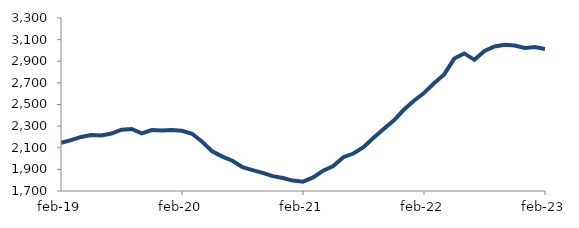
| Category | Series 0 |
|---|---|
| 2019-02-01 | 2144.876 |
| 2019-03-01 | 2171.077 |
| 2019-04-01 | 2199.941 |
| 2019-05-01 | 2218.125 |
| 2019-06-01 | 2213.708 |
| 2019-07-01 | 2231.834 |
| 2019-08-01 | 2267.321 |
| 2019-09-01 | 2273.768 |
| 2019-10-01 | 2233.304 |
| 2019-11-01 | 2263.898 |
| 2019-12-01 | 2259.926 |
| 2020-01-01 | 2265.053 |
| 2020-02-01 | 2256.766 |
| 2020-03-01 | 2229.161 |
| 2020-04-01 | 2155.791 |
| 2020-05-01 | 2066.843 |
| 2020-06-01 | 2018.026 |
| 2020-07-01 | 1979.558 |
| 2020-08-01 | 1920.368 |
| 2020-09-01 | 1893.237 |
| 2020-10-01 | 1867.4 |
| 2020-11-01 | 1837.195 |
| 2020-12-01 | 1819.546 |
| 2021-01-01 | 1796.45 |
| 2021-02-01 | 1786.603 |
| 2021-03-01 | 1826.072 |
| 2021-04-01 | 1887.798 |
| 2021-05-01 | 1930.372 |
| 2021-06-01 | 2012.926 |
| 2021-07-01 | 2046.434 |
| 2021-08-01 | 2105.806 |
| 2021-09-01 | 2192.514 |
| 2021-10-01 | 2272.972 |
| 2021-11-01 | 2351.334 |
| 2021-12-01 | 2451.171 |
| 2022-01-01 | 2534.613 |
| 2022-02-01 | 2606.357 |
| 2022-03-01 | 2696.948 |
| 2022-04-01 | 2778.264 |
| 2022-05-01 | 2924.682 |
| 2022-06-01 | 2972.281 |
| 2022-07-01 | 2912.933 |
| 2022-08-01 | 2994.913 |
| 2022-09-01 | 3036.467 |
| 2022-10-01 | 3052.236 |
| 2022-11-01 | 3044.767 |
| 2022-12-01 | 3023.141 |
| 2023-01-01 | 3030.956 |
| 2023-02-01 | 3013.674 |